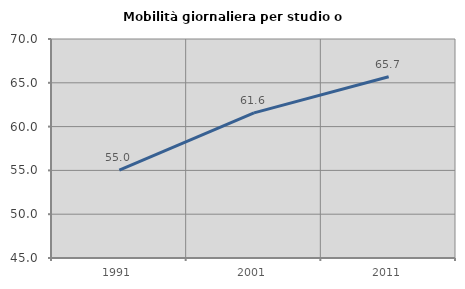
| Category | Mobilità giornaliera per studio o lavoro |
|---|---|
| 1991.0 | 55.044 |
| 2001.0 | 61.565 |
| 2011.0 | 65.698 |